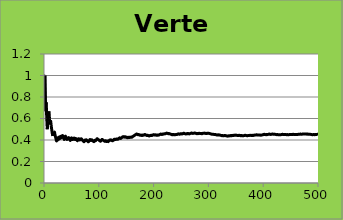
| Category | Verte Cum |
|---|---|
| 0 | 1 |
| 1 | 1 |
| 2 | 0.667 |
| 3 | 0.75 |
| 4 | 0.6 |
| 5 | 0.5 |
| 6 | 0.571 |
| 7 | 0.625 |
| 8 | 0.667 |
| 9 | 0.6 |
| 10 | 0.545 |
| 11 | 0.583 |
| 12 | 0.538 |
| 13 | 0.5 |
| 14 | 0.467 |
| 15 | 0.438 |
| 16 | 0.471 |
| 17 | 0.444 |
| 18 | 0.474 |
| 19 | 0.45 |
| 20 | 0.429 |
| 21 | 0.409 |
| 22 | 0.391 |
| 23 | 0.417 |
| 24 | 0.4 |
| 25 | 0.423 |
| 26 | 0.407 |
| 27 | 0.429 |
| 28 | 0.414 |
| 29 | 0.433 |
| 30 | 0.419 |
| 31 | 0.438 |
| 32 | 0.424 |
| 33 | 0.441 |
| 34 | 0.429 |
| 35 | 0.417 |
| 36 | 0.405 |
| 37 | 0.421 |
| 38 | 0.436 |
| 39 | 0.425 |
| 40 | 0.415 |
| 41 | 0.405 |
| 42 | 0.419 |
| 43 | 0.409 |
| 44 | 0.422 |
| 45 | 0.413 |
| 46 | 0.404 |
| 47 | 0.396 |
| 48 | 0.408 |
| 49 | 0.42 |
| 50 | 0.412 |
| 51 | 0.404 |
| 52 | 0.415 |
| 53 | 0.407 |
| 54 | 0.418 |
| 55 | 0.411 |
| 56 | 0.404 |
| 57 | 0.414 |
| 58 | 0.407 |
| 59 | 0.4 |
| 60 | 0.393 |
| 61 | 0.403 |
| 62 | 0.413 |
| 63 | 0.406 |
| 64 | 0.4 |
| 65 | 0.409 |
| 66 | 0.403 |
| 67 | 0.412 |
| 68 | 0.406 |
| 69 | 0.4 |
| 70 | 0.394 |
| 71 | 0.389 |
| 72 | 0.384 |
| 73 | 0.392 |
| 74 | 0.4 |
| 75 | 0.395 |
| 76 | 0.403 |
| 77 | 0.397 |
| 78 | 0.392 |
| 79 | 0.388 |
| 80 | 0.383 |
| 81 | 0.39 |
| 82 | 0.398 |
| 83 | 0.405 |
| 84 | 0.4 |
| 85 | 0.395 |
| 86 | 0.402 |
| 87 | 0.398 |
| 88 | 0.393 |
| 89 | 0.389 |
| 90 | 0.385 |
| 91 | 0.391 |
| 92 | 0.398 |
| 93 | 0.394 |
| 94 | 0.4 |
| 95 | 0.406 |
| 96 | 0.412 |
| 97 | 0.408 |
| 98 | 0.404 |
| 99 | 0.4 |
| 100 | 0.396 |
| 101 | 0.392 |
| 102 | 0.388 |
| 103 | 0.394 |
| 104 | 0.4 |
| 105 | 0.406 |
| 106 | 0.402 |
| 107 | 0.398 |
| 108 | 0.394 |
| 109 | 0.391 |
| 110 | 0.387 |
| 111 | 0.393 |
| 112 | 0.389 |
| 113 | 0.386 |
| 114 | 0.391 |
| 115 | 0.388 |
| 116 | 0.385 |
| 117 | 0.39 |
| 118 | 0.395 |
| 119 | 0.4 |
| 120 | 0.397 |
| 121 | 0.402 |
| 122 | 0.398 |
| 123 | 0.395 |
| 124 | 0.392 |
| 125 | 0.397 |
| 126 | 0.402 |
| 127 | 0.406 |
| 128 | 0.403 |
| 129 | 0.408 |
| 130 | 0.405 |
| 131 | 0.409 |
| 132 | 0.406 |
| 133 | 0.41 |
| 134 | 0.407 |
| 135 | 0.412 |
| 136 | 0.416 |
| 137 | 0.42 |
| 138 | 0.417 |
| 139 | 0.414 |
| 140 | 0.418 |
| 141 | 0.423 |
| 142 | 0.427 |
| 143 | 0.431 |
| 144 | 0.428 |
| 145 | 0.432 |
| 146 | 0.429 |
| 147 | 0.426 |
| 148 | 0.43 |
| 149 | 0.427 |
| 150 | 0.424 |
| 151 | 0.421 |
| 152 | 0.425 |
| 153 | 0.422 |
| 154 | 0.426 |
| 155 | 0.423 |
| 156 | 0.427 |
| 157 | 0.424 |
| 158 | 0.428 |
| 159 | 0.425 |
| 160 | 0.429 |
| 161 | 0.432 |
| 162 | 0.436 |
| 163 | 0.439 |
| 164 | 0.442 |
| 165 | 0.446 |
| 166 | 0.449 |
| 167 | 0.452 |
| 168 | 0.456 |
| 169 | 0.453 |
| 170 | 0.45 |
| 171 | 0.448 |
| 172 | 0.451 |
| 173 | 0.448 |
| 174 | 0.446 |
| 175 | 0.443 |
| 176 | 0.446 |
| 177 | 0.444 |
| 178 | 0.441 |
| 179 | 0.444 |
| 180 | 0.448 |
| 181 | 0.445 |
| 182 | 0.448 |
| 183 | 0.451 |
| 184 | 0.449 |
| 185 | 0.446 |
| 186 | 0.444 |
| 187 | 0.441 |
| 188 | 0.444 |
| 189 | 0.442 |
| 190 | 0.44 |
| 191 | 0.438 |
| 192 | 0.44 |
| 193 | 0.443 |
| 194 | 0.441 |
| 195 | 0.444 |
| 196 | 0.442 |
| 197 | 0.444 |
| 198 | 0.447 |
| 199 | 0.45 |
| 200 | 0.448 |
| 201 | 0.446 |
| 202 | 0.448 |
| 203 | 0.446 |
| 204 | 0.444 |
| 205 | 0.447 |
| 206 | 0.444 |
| 207 | 0.447 |
| 208 | 0.445 |
| 209 | 0.448 |
| 210 | 0.45 |
| 211 | 0.453 |
| 212 | 0.455 |
| 213 | 0.453 |
| 214 | 0.451 |
| 215 | 0.454 |
| 216 | 0.456 |
| 217 | 0.454 |
| 218 | 0.457 |
| 219 | 0.459 |
| 220 | 0.457 |
| 221 | 0.459 |
| 222 | 0.462 |
| 223 | 0.464 |
| 224 | 0.462 |
| 225 | 0.46 |
| 226 | 0.458 |
| 227 | 0.461 |
| 228 | 0.459 |
| 229 | 0.457 |
| 230 | 0.455 |
| 231 | 0.453 |
| 232 | 0.451 |
| 233 | 0.449 |
| 234 | 0.451 |
| 235 | 0.449 |
| 236 | 0.451 |
| 237 | 0.45 |
| 238 | 0.448 |
| 239 | 0.45 |
| 240 | 0.452 |
| 241 | 0.45 |
| 242 | 0.453 |
| 243 | 0.455 |
| 244 | 0.457 |
| 245 | 0.455 |
| 246 | 0.453 |
| 247 | 0.456 |
| 248 | 0.458 |
| 249 | 0.456 |
| 250 | 0.458 |
| 251 | 0.456 |
| 252 | 0.458 |
| 253 | 0.461 |
| 254 | 0.463 |
| 255 | 0.461 |
| 256 | 0.459 |
| 257 | 0.457 |
| 258 | 0.456 |
| 259 | 0.458 |
| 260 | 0.46 |
| 261 | 0.458 |
| 262 | 0.46 |
| 263 | 0.458 |
| 264 | 0.457 |
| 265 | 0.459 |
| 266 | 0.461 |
| 267 | 0.463 |
| 268 | 0.465 |
| 269 | 0.463 |
| 270 | 0.461 |
| 271 | 0.463 |
| 272 | 0.462 |
| 273 | 0.464 |
| 274 | 0.465 |
| 275 | 0.464 |
| 276 | 0.462 |
| 277 | 0.46 |
| 278 | 0.459 |
| 279 | 0.461 |
| 280 | 0.459 |
| 281 | 0.461 |
| 282 | 0.463 |
| 283 | 0.461 |
| 284 | 0.46 |
| 285 | 0.462 |
| 286 | 0.46 |
| 287 | 0.458 |
| 288 | 0.46 |
| 289 | 0.462 |
| 290 | 0.464 |
| 291 | 0.462 |
| 292 | 0.464 |
| 293 | 0.463 |
| 294 | 0.461 |
| 295 | 0.459 |
| 296 | 0.461 |
| 297 | 0.463 |
| 298 | 0.462 |
| 299 | 0.463 |
| 300 | 0.462 |
| 301 | 0.46 |
| 302 | 0.459 |
| 303 | 0.457 |
| 304 | 0.456 |
| 305 | 0.454 |
| 306 | 0.453 |
| 307 | 0.455 |
| 308 | 0.453 |
| 309 | 0.452 |
| 310 | 0.45 |
| 311 | 0.452 |
| 312 | 0.45 |
| 313 | 0.449 |
| 314 | 0.448 |
| 315 | 0.446 |
| 316 | 0.448 |
| 317 | 0.447 |
| 318 | 0.448 |
| 319 | 0.447 |
| 320 | 0.445 |
| 321 | 0.444 |
| 322 | 0.443 |
| 323 | 0.441 |
| 324 | 0.44 |
| 325 | 0.442 |
| 326 | 0.44 |
| 327 | 0.439 |
| 328 | 0.441 |
| 329 | 0.442 |
| 330 | 0.441 |
| 331 | 0.44 |
| 332 | 0.438 |
| 333 | 0.437 |
| 334 | 0.436 |
| 335 | 0.438 |
| 336 | 0.439 |
| 337 | 0.438 |
| 338 | 0.44 |
| 339 | 0.441 |
| 340 | 0.44 |
| 341 | 0.442 |
| 342 | 0.44 |
| 343 | 0.442 |
| 344 | 0.443 |
| 345 | 0.442 |
| 346 | 0.444 |
| 347 | 0.445 |
| 348 | 0.444 |
| 349 | 0.446 |
| 350 | 0.444 |
| 351 | 0.443 |
| 352 | 0.442 |
| 353 | 0.441 |
| 354 | 0.442 |
| 355 | 0.444 |
| 356 | 0.443 |
| 357 | 0.441 |
| 358 | 0.44 |
| 359 | 0.442 |
| 360 | 0.44 |
| 361 | 0.439 |
| 362 | 0.441 |
| 363 | 0.44 |
| 364 | 0.441 |
| 365 | 0.443 |
| 366 | 0.444 |
| 367 | 0.443 |
| 368 | 0.442 |
| 369 | 0.441 |
| 370 | 0.439 |
| 371 | 0.441 |
| 372 | 0.442 |
| 373 | 0.441 |
| 374 | 0.443 |
| 375 | 0.444 |
| 376 | 0.443 |
| 377 | 0.442 |
| 378 | 0.443 |
| 379 | 0.442 |
| 380 | 0.444 |
| 381 | 0.442 |
| 382 | 0.444 |
| 383 | 0.445 |
| 384 | 0.447 |
| 385 | 0.446 |
| 386 | 0.447 |
| 387 | 0.448 |
| 388 | 0.447 |
| 389 | 0.446 |
| 390 | 0.448 |
| 391 | 0.446 |
| 392 | 0.445 |
| 393 | 0.447 |
| 394 | 0.446 |
| 395 | 0.444 |
| 396 | 0.446 |
| 397 | 0.447 |
| 398 | 0.449 |
| 399 | 0.45 |
| 400 | 0.451 |
| 401 | 0.453 |
| 402 | 0.452 |
| 403 | 0.45 |
| 404 | 0.449 |
| 405 | 0.451 |
| 406 | 0.45 |
| 407 | 0.451 |
| 408 | 0.452 |
| 409 | 0.454 |
| 410 | 0.455 |
| 411 | 0.454 |
| 412 | 0.453 |
| 413 | 0.452 |
| 414 | 0.453 |
| 415 | 0.454 |
| 416 | 0.456 |
| 417 | 0.455 |
| 418 | 0.453 |
| 419 | 0.455 |
| 420 | 0.454 |
| 421 | 0.453 |
| 422 | 0.452 |
| 423 | 0.45 |
| 424 | 0.449 |
| 425 | 0.451 |
| 426 | 0.45 |
| 427 | 0.449 |
| 428 | 0.45 |
| 429 | 0.449 |
| 430 | 0.448 |
| 431 | 0.449 |
| 432 | 0.45 |
| 433 | 0.452 |
| 434 | 0.453 |
| 435 | 0.452 |
| 436 | 0.451 |
| 437 | 0.452 |
| 438 | 0.451 |
| 439 | 0.45 |
| 440 | 0.451 |
| 441 | 0.45 |
| 442 | 0.449 |
| 443 | 0.45 |
| 444 | 0.449 |
| 445 | 0.448 |
| 446 | 0.45 |
| 447 | 0.451 |
| 448 | 0.452 |
| 449 | 0.451 |
| 450 | 0.45 |
| 451 | 0.451 |
| 452 | 0.453 |
| 453 | 0.452 |
| 454 | 0.453 |
| 455 | 0.452 |
| 456 | 0.451 |
| 457 | 0.452 |
| 458 | 0.451 |
| 459 | 0.452 |
| 460 | 0.451 |
| 461 | 0.452 |
| 462 | 0.451 |
| 463 | 0.453 |
| 464 | 0.454 |
| 465 | 0.453 |
| 466 | 0.454 |
| 467 | 0.455 |
| 468 | 0.454 |
| 469 | 0.453 |
| 470 | 0.454 |
| 471 | 0.456 |
| 472 | 0.457 |
| 473 | 0.456 |
| 474 | 0.457 |
| 475 | 0.456 |
| 476 | 0.455 |
| 477 | 0.456 |
| 478 | 0.455 |
| 479 | 0.454 |
| 480 | 0.455 |
| 481 | 0.454 |
| 482 | 0.453 |
| 483 | 0.452 |
| 484 | 0.454 |
| 485 | 0.453 |
| 486 | 0.452 |
| 487 | 0.451 |
| 488 | 0.45 |
| 489 | 0.449 |
| 490 | 0.45 |
| 491 | 0.451 |
| 492 | 0.45 |
| 493 | 0.449 |
| 494 | 0.451 |
| 495 | 0.452 |
| 496 | 0.451 |
| 497 | 0.452 |
| 498 | 0.453 |
| 499 | 0.452 |